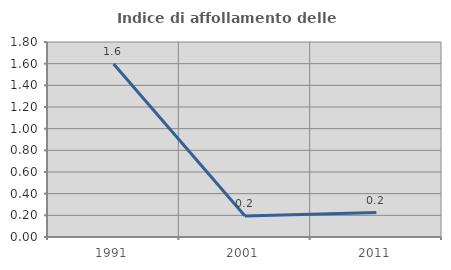
| Category | Indice di affollamento delle abitazioni  |
|---|---|
| 1991.0 | 1.597 |
| 2001.0 | 0.194 |
| 2011.0 | 0.225 |